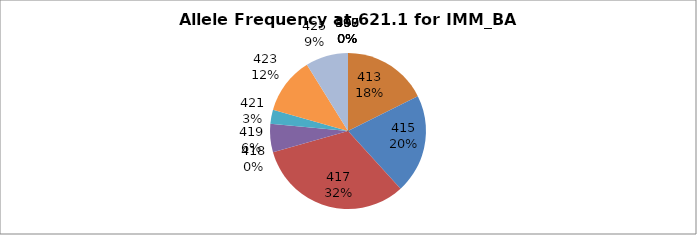
| Category | Series 0 |
|---|---|
| 393.0 | 0 |
| 397.0 | 0 |
| 398.0 | 0 |
| 399.0 | 0 |
| 400.0 | 0 |
| 413.0 | 0.176 |
| 415.0 | 0.206 |
| 417.0 | 0.324 |
| 418.0 | 0 |
| 419.0 | 0.059 |
| 421.0 | 0.029 |
| 423.0 | 0.118 |
| 425.0 | 0.088 |